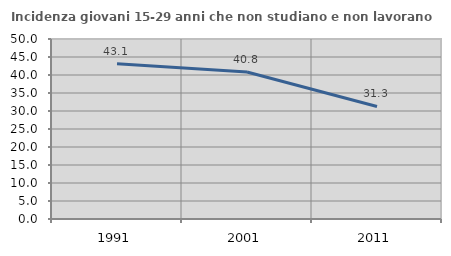
| Category | Incidenza giovani 15-29 anni che non studiano e non lavorano  |
|---|---|
| 1991.0 | 43.148 |
| 2001.0 | 40.844 |
| 2011.0 | 31.255 |